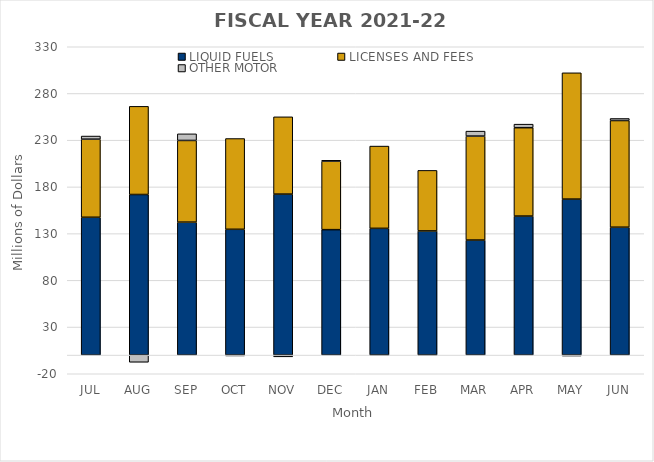
| Category | LIQUID FUELS | LICENSES AND FEES | OTHER MOTOR |
|---|---|---|---|
| JUL | 147.506 | 83.573 | 3.354 |
| AUG | 171.862 | 94.369 | -7.682 |
| SEP | 142.275 | 87.443 | 7.066 |
| OCT | 134.63 | 97.134 | -0.92 |
| NOV | 172.286 | 82.715 | -1.886 |
| DEC | 134.231 | 73.25 | 0.97 |
| JAN | 135.642 | 88.053 | -0.673 |
| FEB | 132.862 | 64.806 | -0.628 |
| MAR | 123.099 | 111.285 | 5.313 |
| APR | 148.778 | 94.606 | 3.771 |
| MAY | 166.935 | 135.173 | -1.032 |
| JUN | 136.864 | 114.169 | 2.188 |